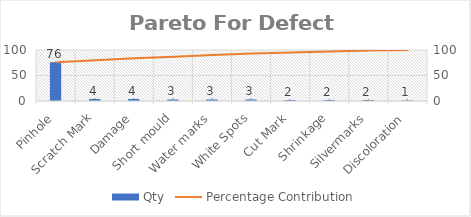
| Category | Qty |
|---|---|
| Pinhole | 76 |
| Scratch Mark | 4 |
| Damage | 4 |
| Short mould | 3 |
| Water marks | 3 |
| White Spots | 3 |
| Cut Mark | 2 |
| Shrinkage | 2 |
| Silvermarks | 2 |
| Discoloration | 1 |